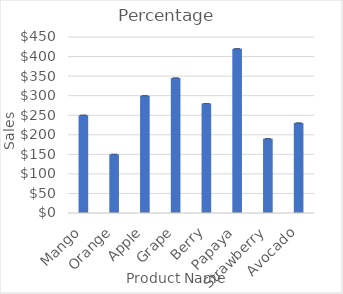
| Category | Sales |
|---|---|
| Mango | 250 |
| Orange | 150 |
| Apple | 300 |
| Grape | 345 |
| Berry | 280 |
| Papaya | 420 |
| Strawberry | 190 |
| Avocado | 230 |